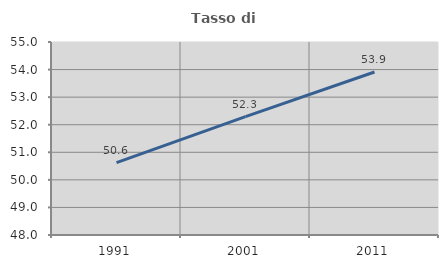
| Category | Tasso di occupazione   |
|---|---|
| 1991.0 | 50.622 |
| 2001.0 | 52.296 |
| 2011.0 | 53.912 |